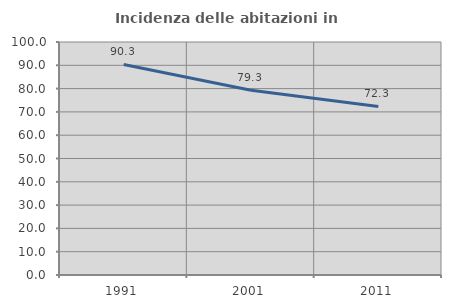
| Category | Incidenza delle abitazioni in proprietà  |
|---|---|
| 1991.0 | 90.347 |
| 2001.0 | 79.31 |
| 2011.0 | 72.332 |